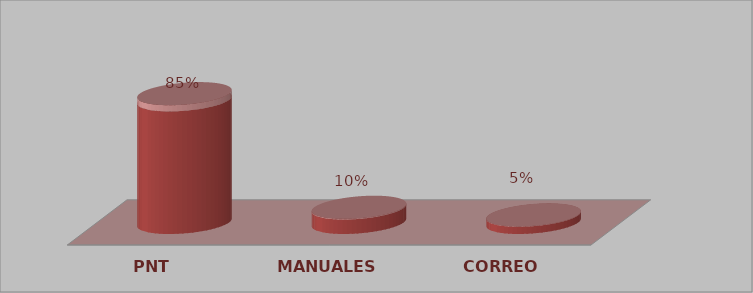
| Category | Series 0 | Series 1 |
|---|---|---|
| PNT | 17 | 0.85 |
| MANUALES | 2 | 0.1 |
| CORREO | 1 | 0.05 |